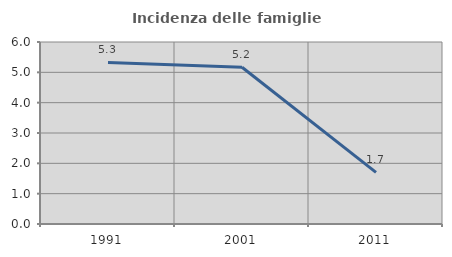
| Category | Incidenza delle famiglie numerose |
|---|---|
| 1991.0 | 5.327 |
| 2001.0 | 5.167 |
| 2011.0 | 1.7 |